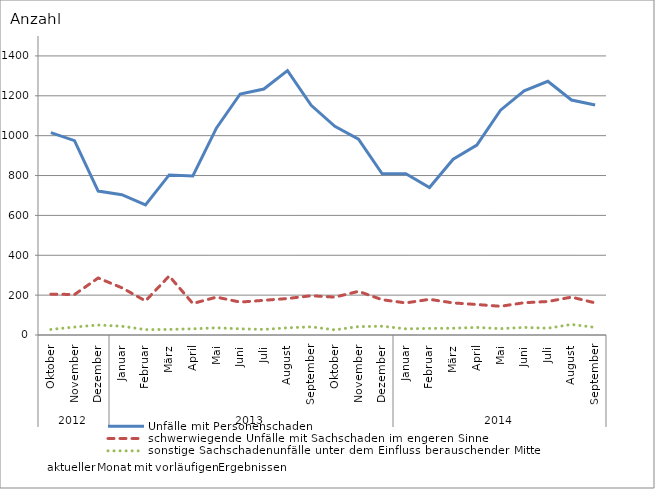
| Category | Unfälle mit Personenschaden | schwerwiegende Unfälle mit Sachschaden im engeren Sinne | sonstige Sachschadenunfälle unter dem Einfluss berauschender Mittel |
|---|---|---|---|
| 0 | 1015 | 205 | 28 |
| 1 | 975 | 203 | 40 |
| 2 | 722 | 286 | 50 |
| 3 | 704 | 237 | 44 |
| 4 | 653 | 171 | 27 |
| 5 | 803 | 296 | 28 |
| 6 | 798 | 158 | 31 |
| 7 | 1039 | 190 | 36 |
| 8 | 1209 | 165 | 31 |
| 9 | 1234 | 174 | 28 |
| 10 | 1326 | 183 | 36 |
| 11 | 1152 | 197 | 41 |
| 12 | 1047 | 190 | 26 |
| 13 | 983 | 219 | 42 |
| 14 | 809 | 177 | 44 |
| 15 | 809 | 161 | 31 |
| 16 | 740 | 179 | 33 |
| 17 | 882 | 161 | 34 |
| 18 | 953 | 153 | 38 |
| 19 | 1128 | 144 | 32 |
| 20 | 1225 | 162 | 38 |
| 21 | 1273 | 168 | 34 |
| 22 | 1179 | 190 | 53 |
| 23 | 1154 | 161 | 38 |